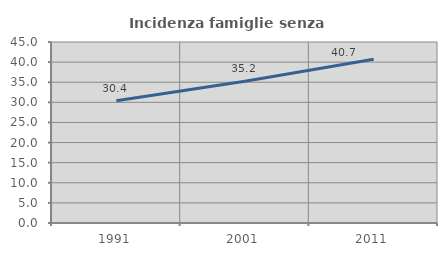
| Category | Incidenza famiglie senza nuclei |
|---|---|
| 1991.0 | 30.389 |
| 2001.0 | 35.22 |
| 2011.0 | 40.707 |